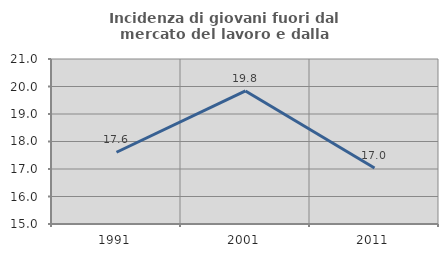
| Category | Incidenza di giovani fuori dal mercato del lavoro e dalla formazione  |
|---|---|
| 1991.0 | 17.609 |
| 2001.0 | 19.839 |
| 2011.0 | 17.038 |